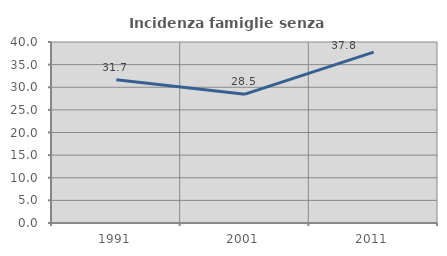
| Category | Incidenza famiglie senza nuclei |
|---|---|
| 1991.0 | 31.663 |
| 2001.0 | 28.478 |
| 2011.0 | 37.771 |